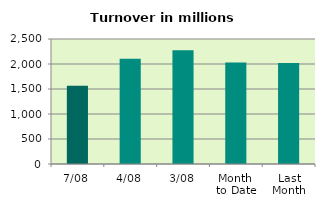
| Category | Series 0 |
|---|---|
| 7/08 | 1566.964 |
| 4/08 | 2103.312 |
| 3/08 | 2276.413 |
| Month 
to Date | 2029.015 |
| Last
Month | 2019.592 |